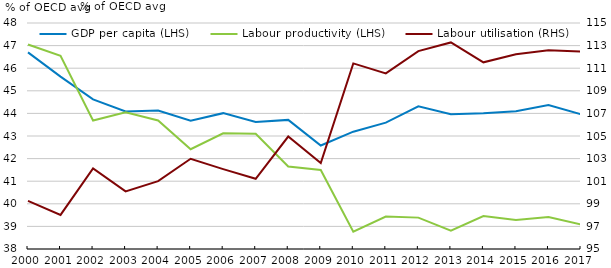
| Category | GDP per capita (LHS) | Labour productivity (LHS) |
|---|---|---|
| 2000.0 | 46.698 | 47.047 |
| 2001.0 | 45.628 | 46.55 |
| 2002.0 | 44.619 | 43.687 |
| 2003.0 | 44.088 | 44.044 |
| 2004.0 | 44.124 | 43.686 |
| 2005.0 | 43.68 | 42.413 |
| 2006.0 | 44.011 | 43.118 |
| 2007.0 | 43.622 | 43.1 |
| 2008.0 | 43.713 | 41.651 |
| 2009.0 | 42.578 | 41.499 |
| 2010.0 | 43.19 | 38.762 |
| 2011.0 | 43.589 | 39.433 |
| 2012.0 | 44.316 | 39.389 |
| 2013.0 | 43.966 | 38.811 |
| 2014.0 | 44.008 | 39.461 |
| 2015.0 | 44.098 | 39.289 |
| 2016.0 | 44.373 | 39.412 |
| 2017.0 | 43.963 | 39.085 |